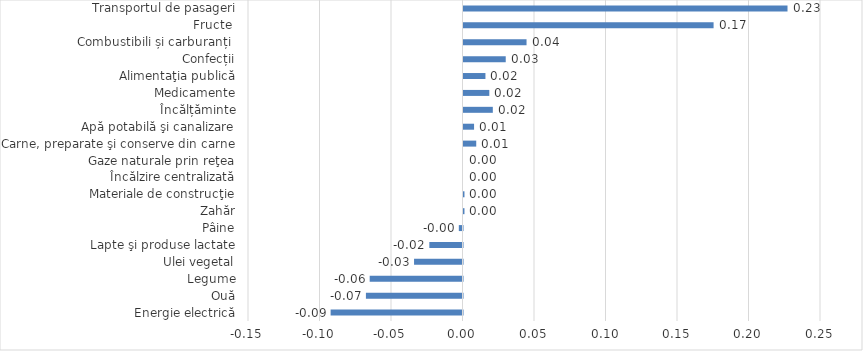
| Category | Series 0 |
|---|---|
| Energie electrică | -0.092 |
| Ouă | -0.068 |
| Legume | -0.065 |
| Ulei vegetal | -0.034 |
| Lapte şi produse lactate | -0.023 |
| Pâine | -0.003 |
| Zahăr | 0.001 |
| Materiale de construcţie | 0.001 |
| Încălzire centralizată | 0 |
| Gaze naturale prin reţea | 0 |
| Carne, preparate şi conserve din carne | 0.009 |
| Apă potabilă şi canalizare | 0.007 |
| Încălțăminte | 0.02 |
| Medicamente | 0.018 |
| Alimentaţia publică | 0.015 |
| Confecții | 0.03 |
| Combustibili și carburanți  | 0.044 |
| Fructe  | 0.175 |
| Transportul de pasageri | 0.227 |